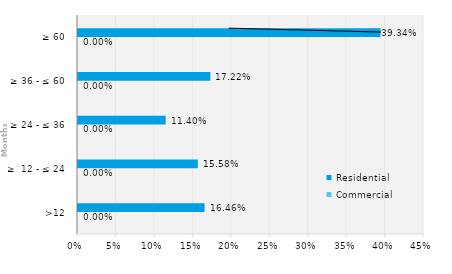
| Category | Commercial | Residential |
|---|---|---|
| >12 | 0 | 0.165 |
| ≥  12 - ≤ 24 | 0 | 0.156 |
| ≥ 24 - ≤ 36 | 0 | 0.114 |
| ≥ 36 - ≤ 60 | 0 | 0.172 |
| ≥ 60 | 0 | 0.393 |